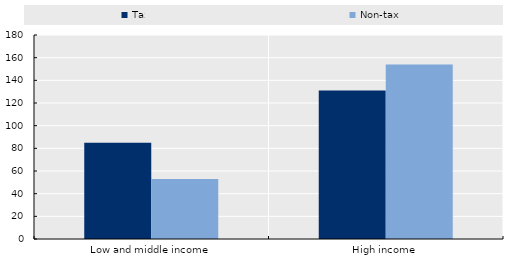
| Category | Tax | Non-tax |
|---|---|---|
| Low and middle income | 85 | 53 |
| High income | 131 | 154 |